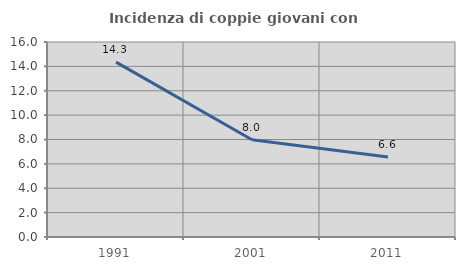
| Category | Incidenza di coppie giovani con figli |
|---|---|
| 1991.0 | 14.347 |
| 2001.0 | 7.976 |
| 2011.0 | 6.56 |